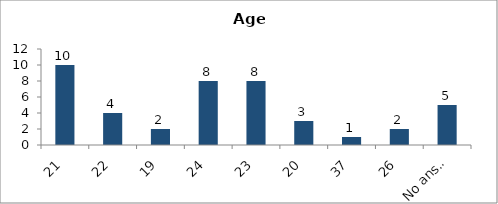
| Category | Age |
|---|---|
| 21 | 10 |
| 22 | 4 |
| 19 | 2 |
| 24 | 8 |
| 23 | 8 |
| 20 | 3 |
| 37 | 1 |
| 26 | 2 |
| No answer | 5 |